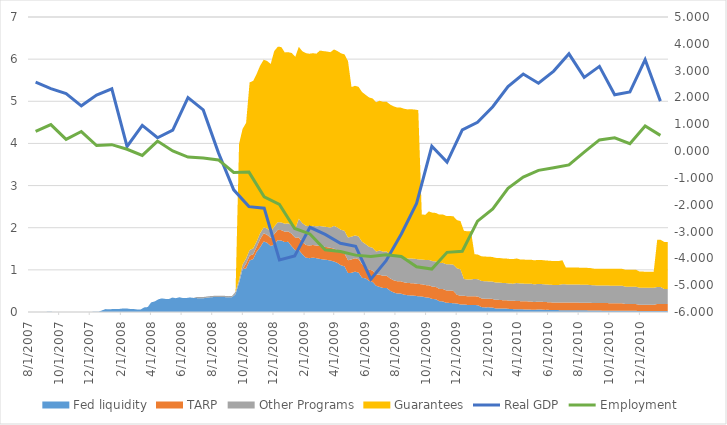
| Category | Real GDP | Employment  |
|---|---|---|
| 8/1/07 | 2.568 | 0.731 |
| 9/1/07 | 2.33 | 0.987 |
| 10/1/07 | 2.144 | 0.435 |
| 11/1/07 | 1.688 | 0.729 |
| 12/1/07 | 2.087 | 0.208 |
| 1/1/08 | 2.322 | 0.24 |
| 2/1/08 | 0.172 | 0.068 |
| 3/1/08 | 0.959 | -0.16 |
| 4/1/08 | 0.497 | 0.375 |
| 5/1/08 | 0.78 | 0.003 |
| 6/1/08 | 1.995 | -0.223 |
| 7/1/08 | 1.536 | -0.256 |
| 8/1/08 | -0.066 | -0.329 |
| 9/1/08 | -1.444 | -0.799 |
| 10/1/08 | -2.071 | -0.784 |
| 11/1/08 | -2.129 | -1.702 |
| 12/1/08 | -4.057 | -1.985 |
| 1/1/09 | -3.911 | -2.887 |
| 2/1/09 | -2.841 | -3.09 |
| 3/1/09 | -3.108 | -3.682 |
| 4/1/09 | -3.436 | -3.747 |
| 5/1/09 | -3.547 | -3.879 |
| 6/1/09 | -4.776 | -3.93 |
| 7/1/09 | -4.09 | -3.869 |
| 8/1/09 | -3.091 | -3.933 |
| 9/1/09 | -1.952 | -4.314 |
| 10/1/09 | 0.178 | -4.399 |
| 11/1/09 | -0.408 | -3.776 |
| 12/1/09 | 0.789 | -3.736 |
| 1/1/10 | 1.071 | -2.613 |
| 2/1/10 | 1.653 | -2.16 |
| 3/1/10 | 2.409 | -1.39 |
| 4/1/10 | 2.874 | -0.966 |
| 5/1/10 | 2.53 | -0.718 |
| 6/1/10 | 2.984 | -0.62 |
| 7/1/10 | 3.627 | -0.516 |
| 8/1/10 | 2.75 | -0.039 |
| 9/1/10 | 3.159 | 0.416 |
| 10/1/10 | 2.102 | 0.496 |
| 11/1/10 | 2.204 | 0.278 |
| 12/1/10 | 3.407 | 0.933 |
| 1/1/11 | 1.863 | 0.587 |